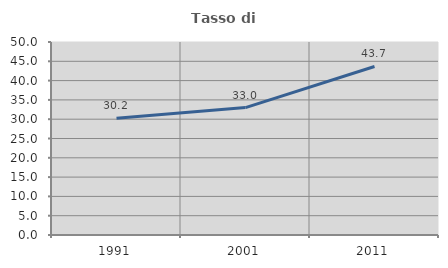
| Category | Tasso di occupazione   |
|---|---|
| 1991.0 | 30.235 |
| 2001.0 | 33.017 |
| 2011.0 | 43.66 |